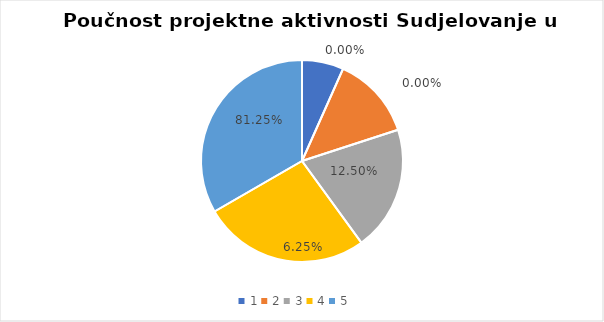
| Category | Series 0 | Series 1 |
|---|---|---|
| 0 | 1 | 0 |
| 1 | 2 | 0 |
| 2 | 3 | 0.125 |
| 3 | 4 | 0.062 |
| 4 | 5 | 0.812 |